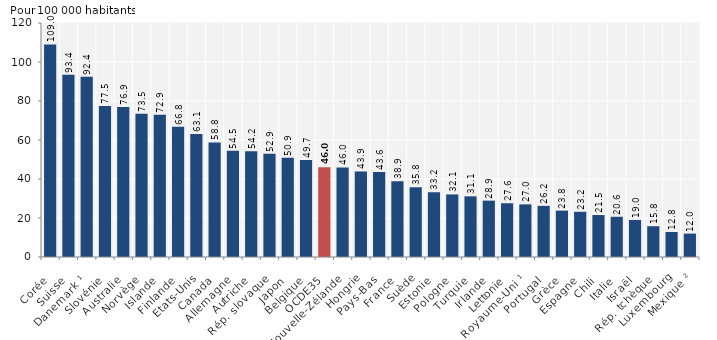
| Category | Series 0 |
|---|---|
| Corée | 108.98 |
| Suisse | 93.41 |
| Danemark ¹ | 92.41 |
| Slovénie | 77.49 |
| Australie | 76.9 |
| Norvège | 73.45 |
| Islande | 72.89 |
| Finlande | 66.81 |
| Etats-Unis | 63.06 |
| Canada | 58.76 |
| Allemagne | 54.5 |
| Autriche | 54.18 |
| Rép. slovaque | 52.93 |
| Japon | 50.92 |
| Belgique | 49.68 |
| OCDE35 | 45.977 |
| Nouvelle-Zélande | 45.96 |
| Hongrie | 43.87 |
| Pays-Bas | 43.62 |
| France | 38.86 |
| Suède | 35.76 |
| Estonie | 33.15 |
| Pologne | 32.08 |
| Turquie | 31.11 |
| Irlande | 28.91 |
| Lettonie | 27.56 |
| Royaume-Uni ¹ | 26.99 |
| Portugal | 26.22 |
| Grèce | 23.79 |
| Espagne | 23.18 |
| Chili | 21.52 |
| Italie | 20.62 |
| Israël | 19 |
| Rép. tchèque | 15.79 |
| Luxembourg | 12.82 |
| Mexique ² | 12 |